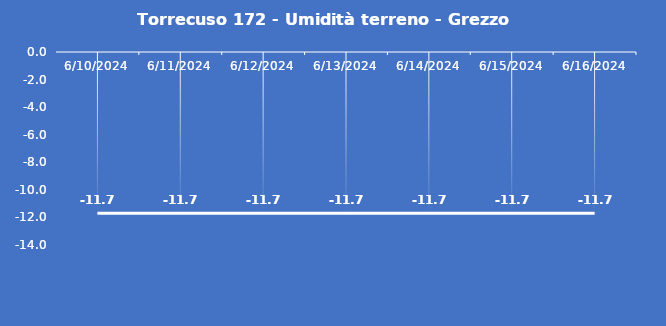
| Category | Torrecuso 172 - Umidità terreno - Grezzo (%VWC) |
|---|---|
| 6/10/24 | -11.7 |
| 6/11/24 | -11.7 |
| 6/12/24 | -11.7 |
| 6/13/24 | -11.7 |
| 6/14/24 | -11.7 |
| 6/15/24 | -11.7 |
| 6/16/24 | -11.7 |